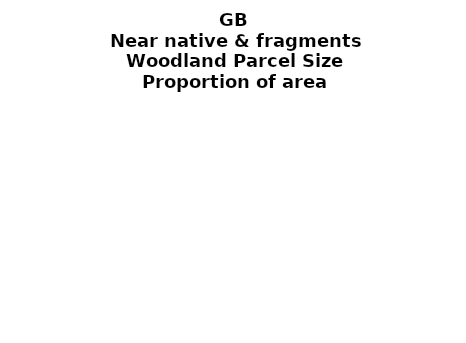
| Category | Near native & fragments |
|---|---|
| <5 ha | 0.004 |
| ≥5 and <10 ha | 0.001 |
| ≥10 and <15 ha | 0.001 |
| ≥15 and <20 ha | 0.001 |
| ≥20 and <25 ha | 0 |
| ≥25 and <30 ha | 0.001 |
| ≥30 and <35 ha | 0.001 |
| ≥35 and <40 ha | 0 |
| ≥40 and <45 ha | 0 |
| ≥45 and <50 ha | 0 |
| ≥50 and <60 ha | 0.001 |
| ≥60 and <70 ha | 0.001 |
| ≥70 and <80 ha | 0 |
| ≥80 and <90 ha | 0 |
| ≥90 and <100 ha | 0 |
| ≥100 and <150 ha | 0.001 |
| ≥150 and <200 ha | 0.001 |
| ≥200 ha | 0.005 |